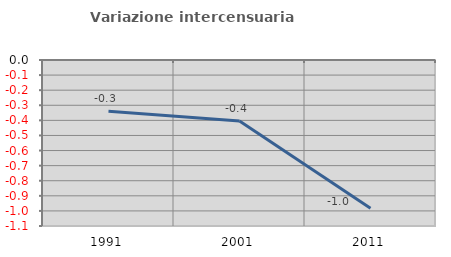
| Category | Variazione intercensuaria annua |
|---|---|
| 1991.0 | -0.34 |
| 2001.0 | -0.403 |
| 2011.0 | -0.982 |